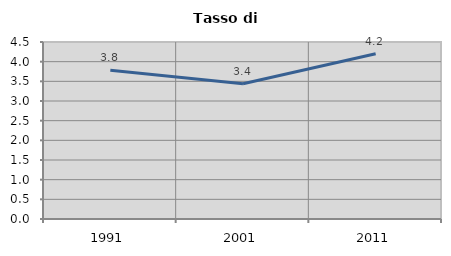
| Category | Tasso di disoccupazione   |
|---|---|
| 1991.0 | 3.781 |
| 2001.0 | 3.438 |
| 2011.0 | 4.2 |